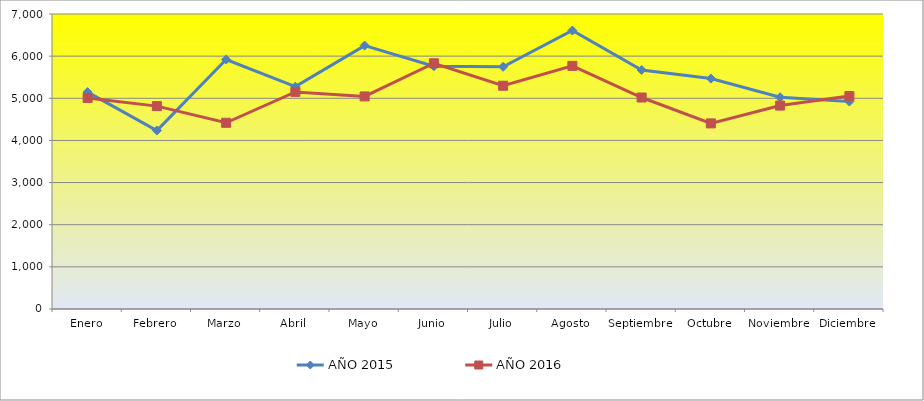
| Category | AÑO 2015 | AÑO 2016 |
|---|---|---|
| Enero | 5147 | 5008 |
| Febrero | 4235 | 4814 |
| Marzo | 5919 | 4419 |
| Abril | 5276 | 5151 |
| Mayo | 6250 | 5044 |
| Junio | 5759 | 5831 |
| Julio | 5747 | 5298 |
| Agosto | 6608 | 5769 |
| Septiembre | 5672 | 5018 |
| Octubre | 5468 | 4404 |
| Noviembre | 5024 | 4827 |
| Diciembre | 4922 | 5053 |